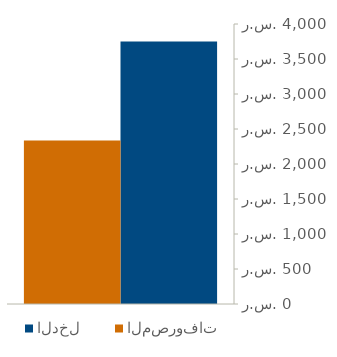
| Category | الدخل | المصروفات |
|---|---|---|
| 0 | 3750 | 2336 |